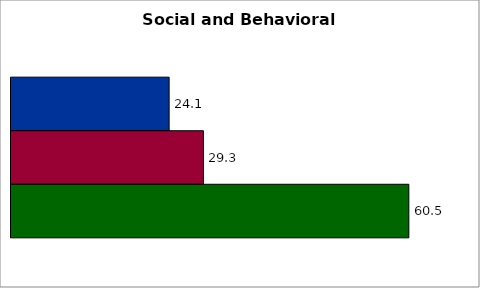
| Category | 50 states and D.C. | SREB states | State |
|---|---|---|---|
| 0 | 24.064 | 29.28 | 60.541 |